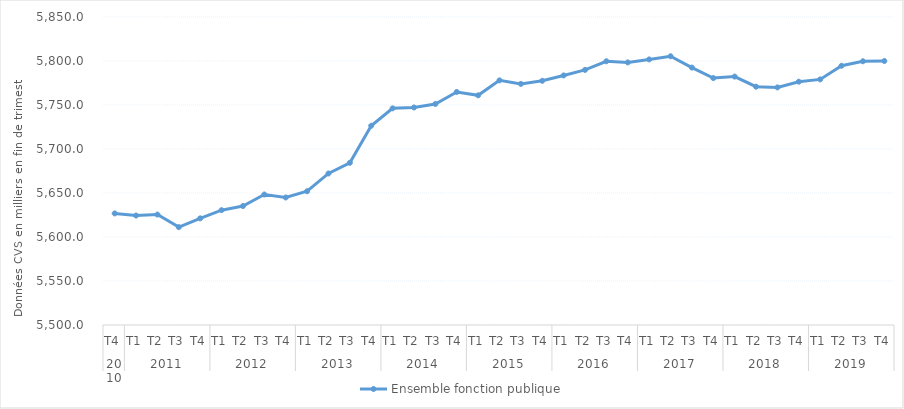
| Category | Ensemble fonction publique |
|---|---|
| 0 | 5626.8 |
| 1 | 5624.4 |
| 2 | 5625.5 |
| 3 | 5611.2 |
| 4 | 5621.2 |
| 5 | 5630.5 |
| 6 | 5635.2 |
| 7 | 5648.3 |
| 8 | 5644.9 |
| 9 | 5652 |
| 10 | 5672.2 |
| 11 | 5684.3 |
| 12 | 5726.4 |
| 13 | 5746.2 |
| 14 | 5747.2 |
| 15 | 5751.2 |
| 16 | 5764.8 |
| 17 | 5761 |
| 18 | 5778 |
| 19 | 5774 |
| 20 | 5777.5 |
| 21 | 5783.6 |
| 22 | 5789.9 |
| 23 | 5799.7 |
| 24 | 5798.4 |
| 25 | 5801.8 |
| 26 | 5805.4 |
| 27 | 5792.5 |
| 28 | 5780.6 |
| 29 | 5782.3 |
| 30 | 5770.8 |
| 31 | 5770 |
| 32 | 5776.5 |
| 33 | 5779.1 |
| 34 | 5794.6 |
| 35 | 5799.7 |
| 36 | 5800 |